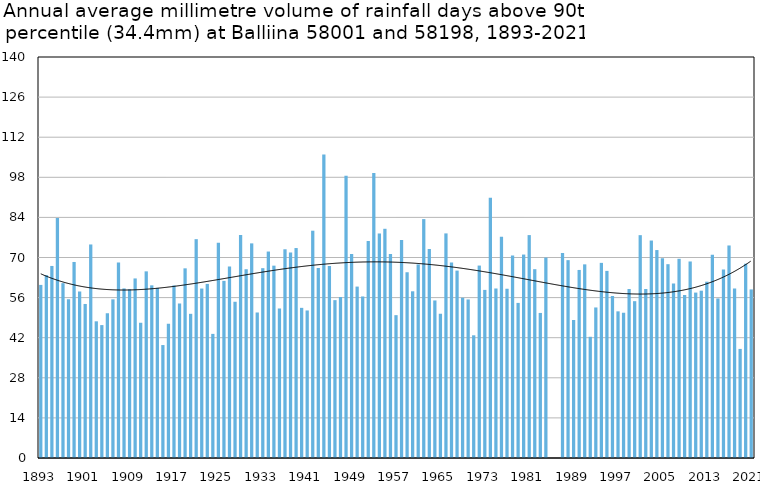
| Category | Annual average mm in days above 90th percentile |
|---|---|
| 1893 | 60.433 |
| 1894 | 63.847 |
| 1895 | 67.05 |
| 1896 | 83.825 |
| 1897 | 61.042 |
| 1898 | 55.422 |
| 1899 | 68.441 |
| 1900 | 58.092 |
| 1901 | 53.777 |
| 1902 | 74.55 |
| 1903 | 47.72 |
| 1904 | 46.4 |
| 1905 | 50.512 |
| 1906 | 55.389 |
| 1907 | 68.264 |
| 1908 | 59.209 |
| 1909 | 58.878 |
| 1910 | 62.69 |
| 1911 | 47.217 |
| 1912 | 65.164 |
| 1913 | 60.281 |
| 1914 | 59.38 |
| 1915 | 39.433 |
| 1916 | 46.879 |
| 1917 | 60.246 |
| 1918 | 53.943 |
| 1919 | 66.218 |
| 1920 | 50.338 |
| 1921 | 76.4 |
| 1922 | 59.162 |
| 1923 | 60.786 |
| 1924 | 43.333 |
| 1925 | 75.132 |
| 1926 | 61.84 |
| 1927 | 66.884 |
| 1928 | 54.55 |
| 1929 | 77.826 |
| 1930 | 65.906 |
| 1931 | 74.931 |
| 1932 | 50.8 |
| 1933 | 66.278 |
| 1934 | 72.082 |
| 1935 | 67.153 |
| 1936 | 52.2 |
| 1937 | 72.871 |
| 1938 | 71.786 |
| 1939 | 73.3 |
| 1940 | 52.423 |
| 1941 | 51.511 |
| 1942 | 79.357 |
| 1943 | 66.333 |
| 1944 | 105.97 |
| 1945 | 67.05 |
| 1946 | 55.117 |
| 1947 | 56.231 |
| 1948 | 98.527 |
| 1949 | 71.227 |
| 1950 | 59.846 |
| 1951 | 56.4 |
| 1952 | 75.755 |
| 1953 | 99.508 |
| 1954 | 78.386 |
| 1955 | 80.023 |
| 1956 | 71.25 |
| 1957 | 49.873 |
| 1958 | 76.124 |
| 1959 | 64.852 |
| 1960 | 58.2 |
| 1961 | 67.593 |
| 1962 | 83.405 |
| 1963 | 72.965 |
| 1964 | 55.008 |
| 1965 | 50.327 |
| 1966 | 78.412 |
| 1967 | 68.275 |
| 1968 | 65.429 |
| 1969 | 55.933 |
| 1970 | 55.35 |
| 1971 | 42.84 |
| 1972 | 67.185 |
| 1973 | 58.69 |
| 1974 | 90.88 |
| 1975 | 59.181 |
| 1976 | 77.217 |
| 1977 | 59.091 |
| 1978 | 70.711 |
| 1979 | 54.15 |
| 1980 | 71.029 |
| 1981 | 77.822 |
| 1982 | 65.92 |
| 1983 | 50.645 |
| 1984 | 69.985 |
| 1985 | 0 |
| 1986 | 0 |
| 1987 | 71.573 |
| 1988 | 69.077 |
| 1989 | 48.189 |
| 1990 | 65.657 |
| 1991 | 67.608 |
| 1992 | 42.32 |
| 1993 | 52.556 |
| 1994 | 68.125 |
| 1995 | 65.325 |
| 1996 | 56.543 |
| 1997 | 51.2 |
| 1998 | 50.72 |
| 1999 | 59 |
| 2000 | 54.75 |
| 2001 | 77.8 |
| 2002 | 59 |
| 2003 | 75.923 |
| 2004 | 72.6 |
| 2005 | 69.75 |
| 2006 | 67.667 |
| 2007 | 60.883 |
| 2008 | 69.547 |
| 2009 | 56.92 |
| 2010 | 68.612 |
| 2011 | 57.75 |
| 2012 | 58.415 |
| 2013 | 61.556 |
| 2014 | 71 |
| 2015 | 55.706 |
| 2016 | 65.82 |
| 2017 | 74.2 |
| 2018 | 59.218 |
| 2019 | 38.086 |
| 2020 | 67.821 |
| 2021 | 58.853 |